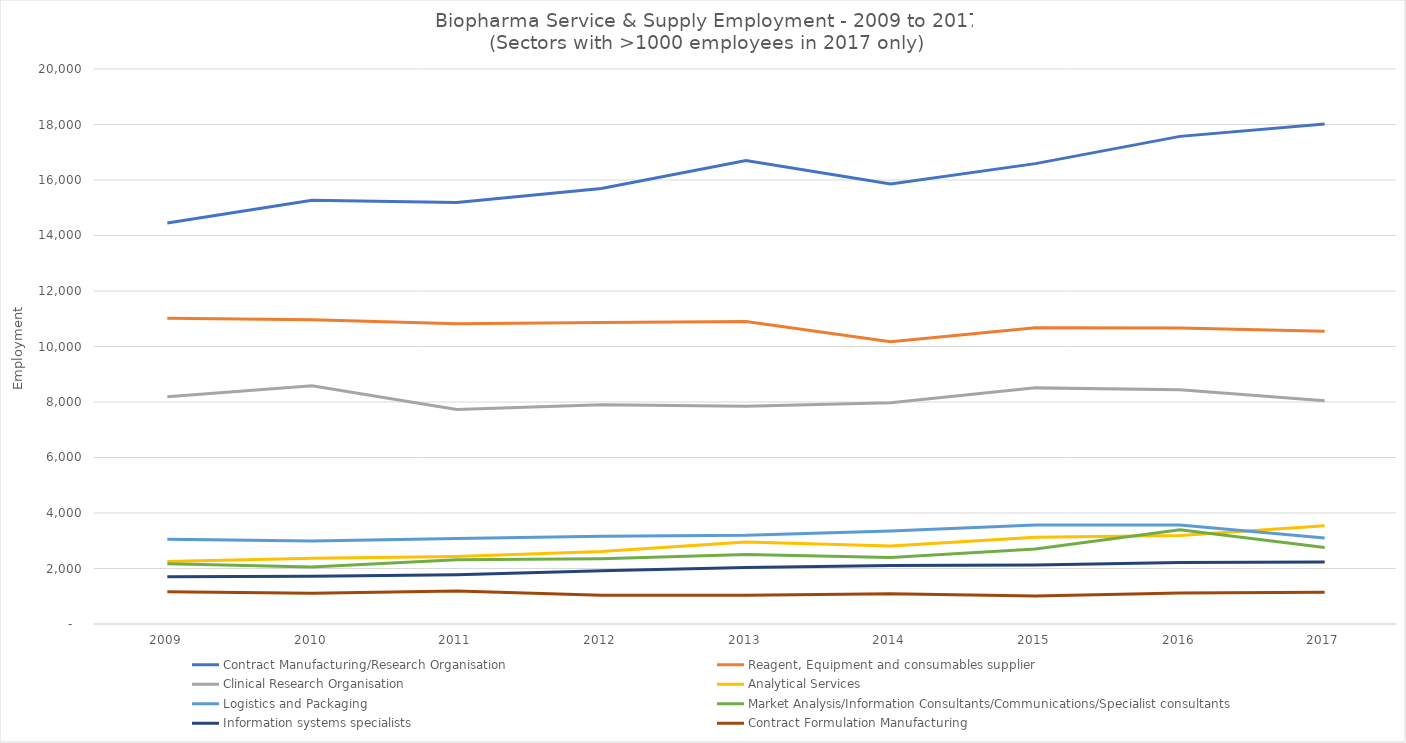
| Category | Contract Manufacturing/Research Organisation | Reagent, Equipment and consumables supplier | Clinical Research Organisation | Analytical Services | Logistics and Packaging | Market Analysis/Information Consultants/Communications/Specialist consultants | Information systems specialists | Contract Formulation Manufacturing |
|---|---|---|---|---|---|---|---|---|
| 2009 | 14449 | 11016 | 8189 | 2256 | 3051 | 2175 | 1701 | 1162 |
| 2010 | 15267 | 10967 | 8588 | 2372 | 2992 | 2050 | 1721 | 1112 |
| 2011 | 15186 | 10818 | 7732 | 2436 | 3085 | 2315 | 1774 | 1186 |
| 2012 | 15695 | 10867 | 7904 | 2611 | 3166 | 2355 | 1920 | 1035 |
| 2013 | 16701 | 10900 | 7850 | 2958 | 3194 | 2503 | 2032 | 1036 |
| 2014 | 15855 | 10174 | 7971 | 2812 | 3352 | 2395 | 2105 | 1094 |
| 2015 | 16590 | 10678 | 8509 | 3124 | 3566 | 2706 | 2128 | 1006 |
| 2016 | 17572 | 10670 | 8437 | 3187 | 3565 | 3397 | 2214 | 1118 |
| 2017 | 18021 | 10552 | 8047 | 3540 | 3095 | 2760 | 2234 | 1140 |